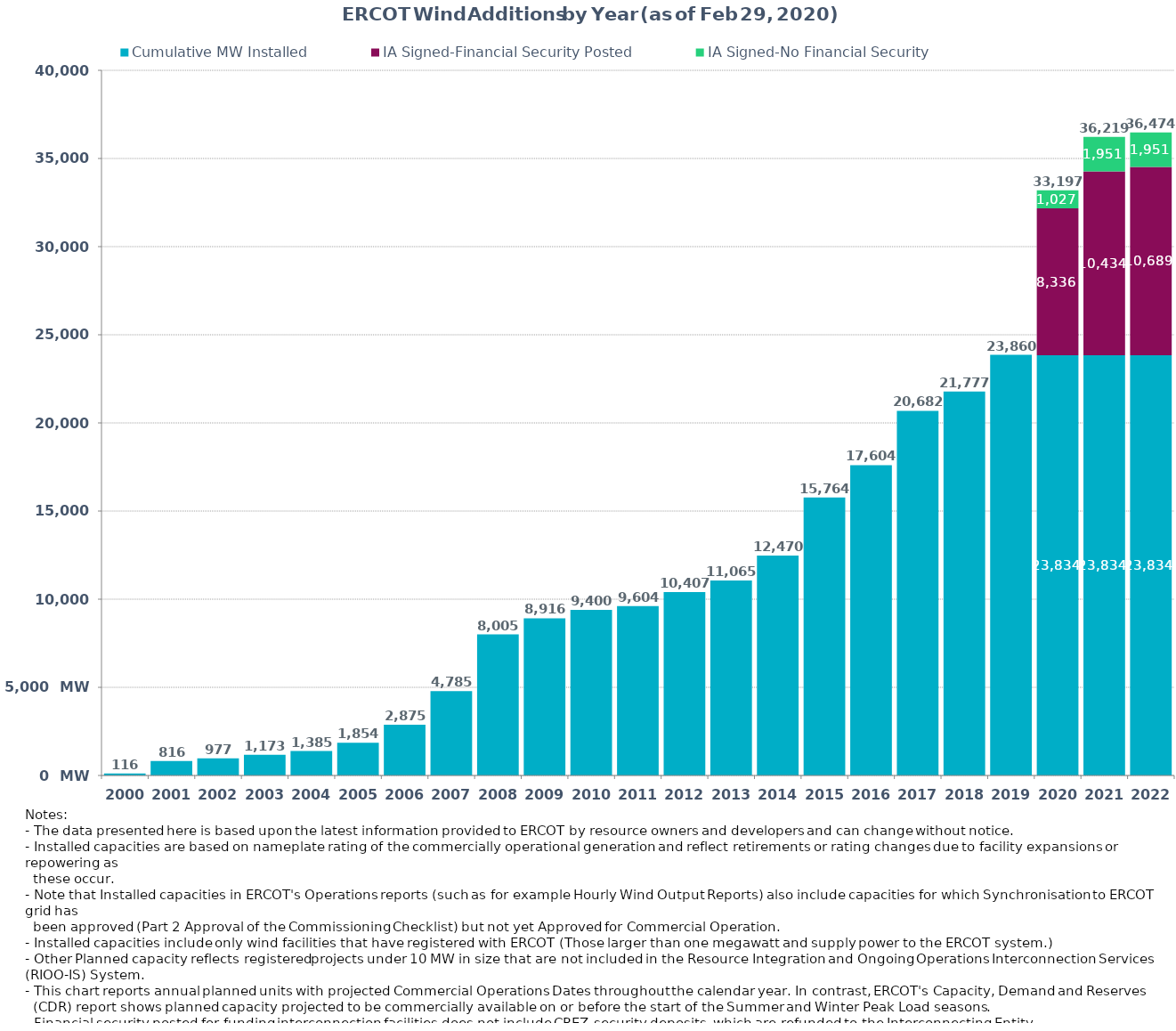
| Category | Cumulative MW Installed | IA Signed-Financial Security Posted  | IA Signed-No Financial Security  | Other Planned | Cumulative Installed and Planned |
|---|---|---|---|---|---|
| 2000.0 | 116 | 0 | 0 | 0 | 116 |
| 2001.0 | 816 | 0 | 0 | 0 | 816 |
| 2002.0 | 977 | 0 | 0 | 0 | 977 |
| 2003.0 | 1173 | 0 | 0 | 0 | 1173 |
| 2004.0 | 1385 | 0 | 0 | 0 | 1385 |
| 2005.0 | 1854 | 0 | 0 | 0 | 1854 |
| 2006.0 | 2875 | 0 | 0 | 0 | 2875 |
| 2007.0 | 4785 | 0 | 0 | 0 | 4785 |
| 2008.0 | 8005 | 0 | 0 | 0 | 8005 |
| 2009.0 | 8916 | 0 | 0 | 0 | 8916 |
| 2010.0 | 9400 | 0 | 0 | 0 | 9400 |
| 2011.0 | 9604 | 0 | 0 | 0 | 9604 |
| 2012.0 | 10407 | 0 | 0 | 0 | 10407 |
| 2013.0 | 11065 | 0 | 0 | 0 | 11065 |
| 2014.0 | 12470 | 0 | 0 | 0 | 12470 |
| 2015.0 | 15764 | 0 | 0 | 0 | 15764 |
| 2016.0 | 17604 | 0 | 0 | 0 | 17604 |
| 2017.0 | 20682 | 0 | 0 | 0 | 20682 |
| 2018.0 | 21777 | 0 | 0 | 0 | 21777 |
| 2019.0 | 23860 | 0 | 0 | 0 | 23860 |
| 2020.0 | 23834.24 | 8336 | 1027 | 0 | 33197.24 |
| 2021.0 | 23834.24 | 10434.21 | 1950.6 | 0 | 36219.05 |
| 2022.0 | 23834.24 | 10689 | 1950.6 | 0 | 36474.35 |